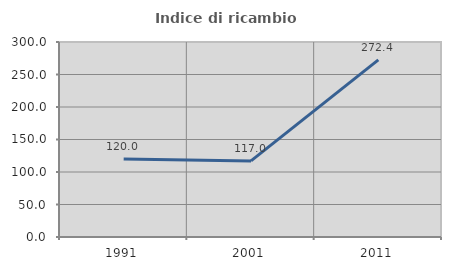
| Category | Indice di ricambio occupazionale  |
|---|---|
| 1991.0 | 120 |
| 2001.0 | 117.021 |
| 2011.0 | 272.414 |